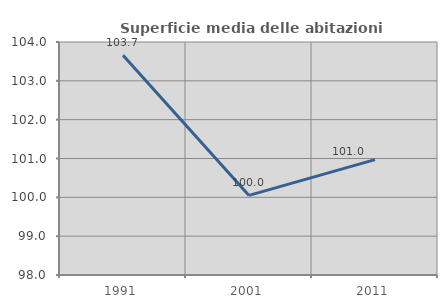
| Category | Superficie media delle abitazioni occupate |
|---|---|
| 1991.0 | 103.662 |
| 2001.0 | 100.049 |
| 2011.0 | 100.971 |